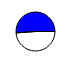
| Category | Series 0 |
|---|---|
| 0 | 10473174 |
| 1 | 10966642 |